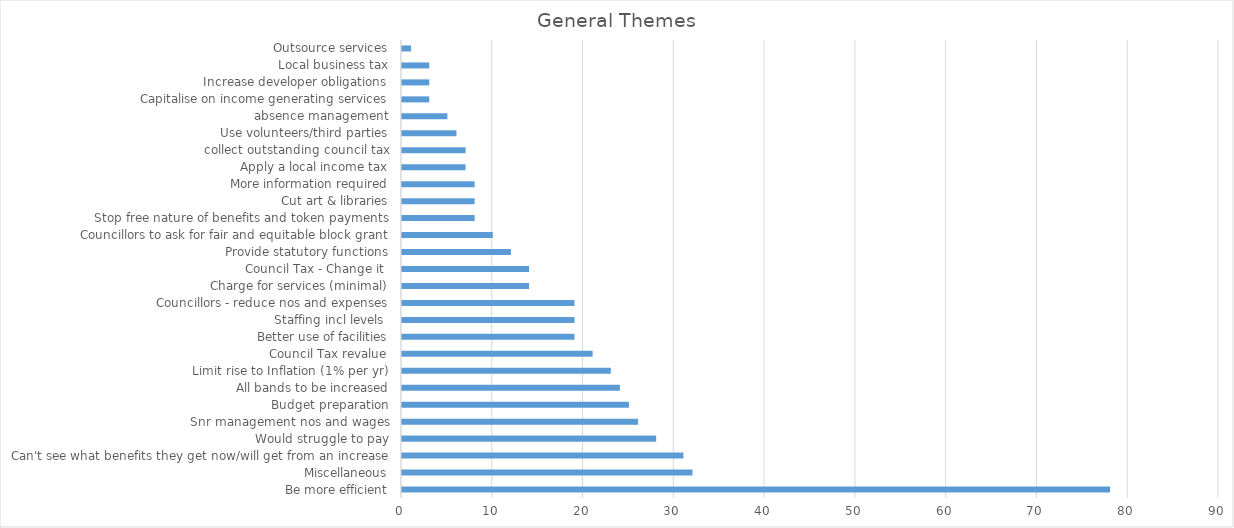
| Category | Series 0 |
|---|---|
| Be more efficient | 78 |
| Miscellaneous | 32 |
| Can't see what benefits they get now/will get from an increase | 31 |
| Would struggle to pay | 28 |
| Snr management nos and wages | 26 |
| Budget preparation | 25 |
| All bands to be increased | 24 |
| Limit rise to Inflation (1% per yr) | 23 |
| Council Tax revalue | 21 |
| Better use of facilities | 19 |
| Staffing incl levels  | 19 |
| Councillors - reduce nos and expenses | 19 |
| Charge for services (minimal) | 14 |
| Council Tax - Change it  | 14 |
| Provide statutory functions | 12 |
| Councillors to ask for fair and equitable block grant | 10 |
| Stop free nature of benefits and token payments | 8 |
| Cut art & libraries | 8 |
| More information required | 8 |
| Apply a local income tax | 7 |
| collect outstanding council tax | 7 |
| Use volunteers/third parties | 6 |
| absence management | 5 |
| Capitalise on income generating services | 3 |
| Increase developer obligations | 3 |
| Local business tax | 3 |
| Outsource services | 1 |